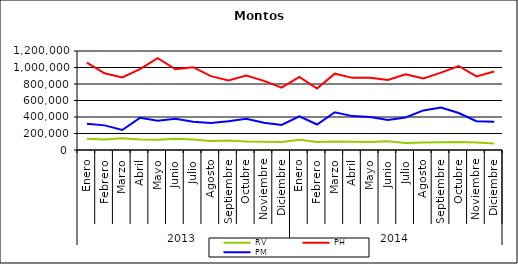
| Category | RV | PH | PM |
|---|---|---|---|
| 0 | 136808.804 | 1058774.967 | 316751.291 |
| 1 | 127193.421 | 930111.334 | 298480.292 |
| 2 | 142052.509 | 880100.908 | 242691.68 |
| 3 | 126637.277 | 980038.371 | 389833.89 |
| 4 | 123189.846 | 1112542.201 | 355777.139 |
| 5 | 135184.022 | 977877.296 | 379782.022 |
| 6 | 127790.361 | 1003315.643 | 342842.568 |
| 7 | 110532.346 | 895717.973 | 326616.455 |
| 8 | 114630.859 | 843607.598 | 348985.725 |
| 9 | 102262.08 | 901170.281 | 379642.157 |
| 10 | 99242.352 | 837424.505 | 330278.777 |
| 11 | 96243.301 | 754952.55 | 304473.582 |
| 12 | 124770.971 | 885857.327 | 408057.686 |
| 13 | 96987.292 | 744736.746 | 309218.036 |
| 14 | 103624.997 | 925209.281 | 458118.752 |
| 15 | 100007.683 | 874534.649 | 410841.727 |
| 16 | 96199.147 | 875356.86 | 399197.561 |
| 17 | 104965.63 | 848001.408 | 363776.247 |
| 18 | 85979.134 | 918529.646 | 394798.235 |
| 19 | 91006.222 | 867037.612 | 479726.319 |
| 20 | 95061.186 | 938312.305 | 516086.875 |
| 21 | 98427.295 | 1018217.103 | 448738.646 |
| 22 | 91856.212 | 892374.454 | 348926.607 |
| 23 | 77505.291 | 952396.362 | 342998.452 |